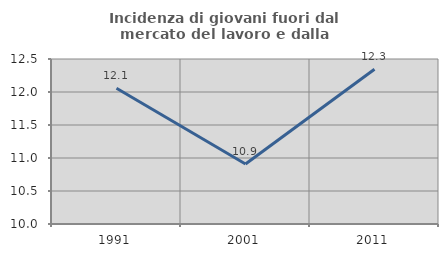
| Category | Incidenza di giovani fuori dal mercato del lavoro e dalla formazione  |
|---|---|
| 1991.0 | 12.057 |
| 2001.0 | 10.909 |
| 2011.0 | 12.346 |